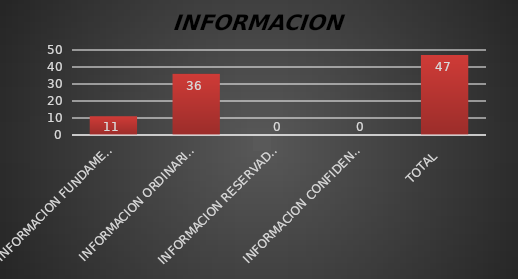
| Category | Series 1 |
|---|---|
| INFORMACION FUNDAMENTAL  | 11 |
| INFORMACION ORDINARIA  | 36 |
| INFORMACION RESERVADA  | 0 |
| INFORMACION CONFIDENCIAL  | 0 |
| TOTAL  | 47 |